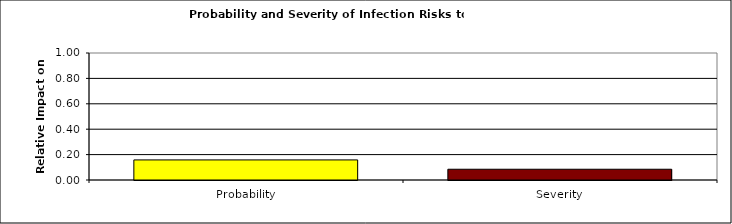
| Category | Series 0 |
|---|---|
| Probability | 0.158 |
| Severity | 0.085 |